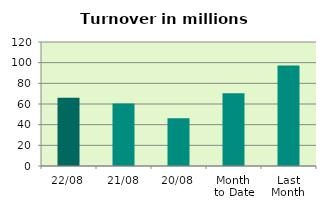
| Category | Series 0 |
|---|---|
| 22/08 | 65.993 |
| 21/08 | 60.433 |
| 20/08 | 46.228 |
| Month 
to Date | 70.462 |
| Last
Month | 97.283 |